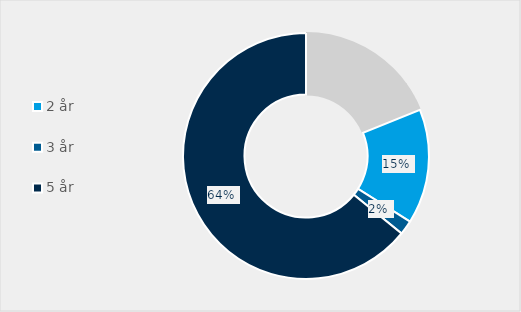
| Category | Series 0 |
|---|---|
| Ikke spesifisert | 0.151 |
| 0 år | 0.038 |
| 2 år | 0.151 |
| 3 år | 0.019 |
| 5 år | 0.642 |